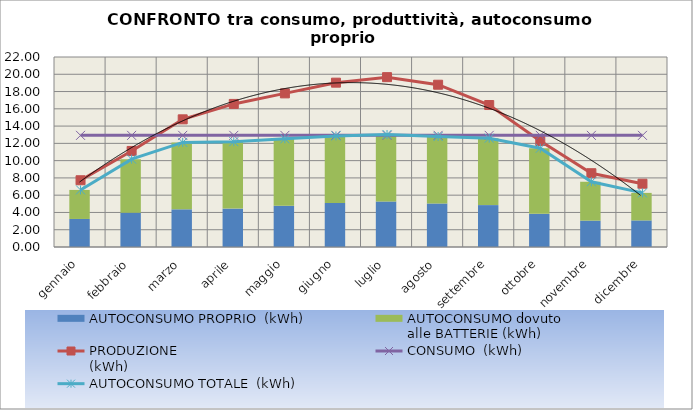
| Category | AUTOCONSUMO PROPRIO  (kWh) | AUTOCONSUMO dovuto
alle BATTERIE (kWh) |
|---|---|---|
| 0 | 3.247 | 3.361 |
| 1 | 3.977 | 6.193 |
| 2 | 4.361 | 7.752 |
| 3 | 4.444 | 7.752 |
| 4 | 4.771 | 7.752 |
| 5 | 5.103 | 7.752 |
| 6 | 5.275 | 7.752 |
| 7 | 5.039 | 7.752 |
| 8 | 4.85 | 7.752 |
| 9 | 3.841 | 7.591 |
| 10 | 3.055 | 4.5 |
| 11 | 3.079 | 3.187 |